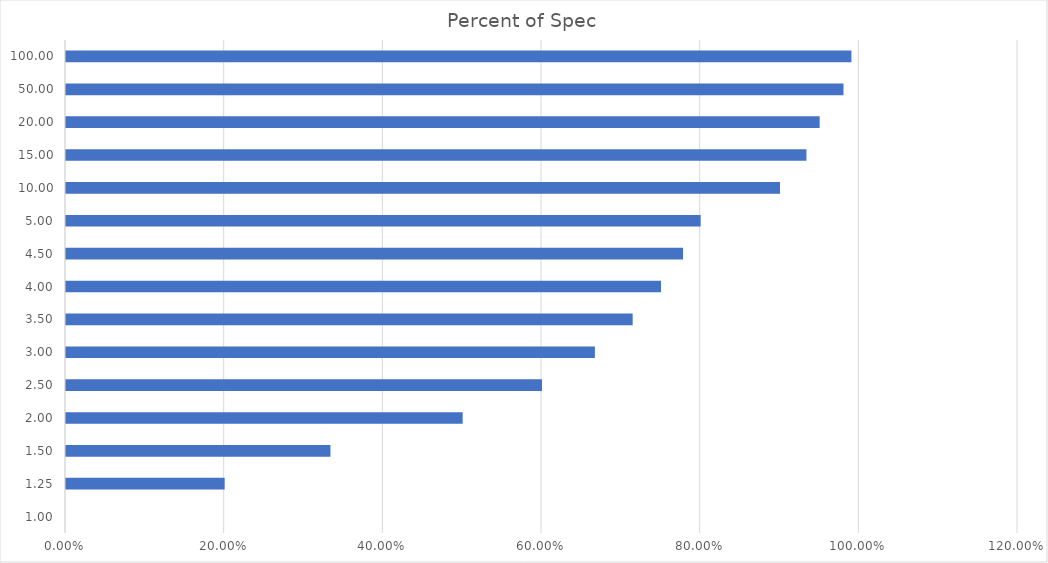
| Category | Percent of |
|---|---|
| 1.0 | 0 |
| 1.25 | 0.2 |
| 1.5 | 0.333 |
| 2.0 | 0.5 |
| 2.5 | 0.6 |
| 3.0 | 0.667 |
| 3.5 | 0.714 |
| 4.0 | 0.75 |
| 4.5 | 0.778 |
| 5.0 | 0.8 |
| 10.0 | 0.9 |
| 15.0 | 0.933 |
| 20.0 | 0.95 |
| 50.0 | 0.98 |
| 100.0 | 0.99 |